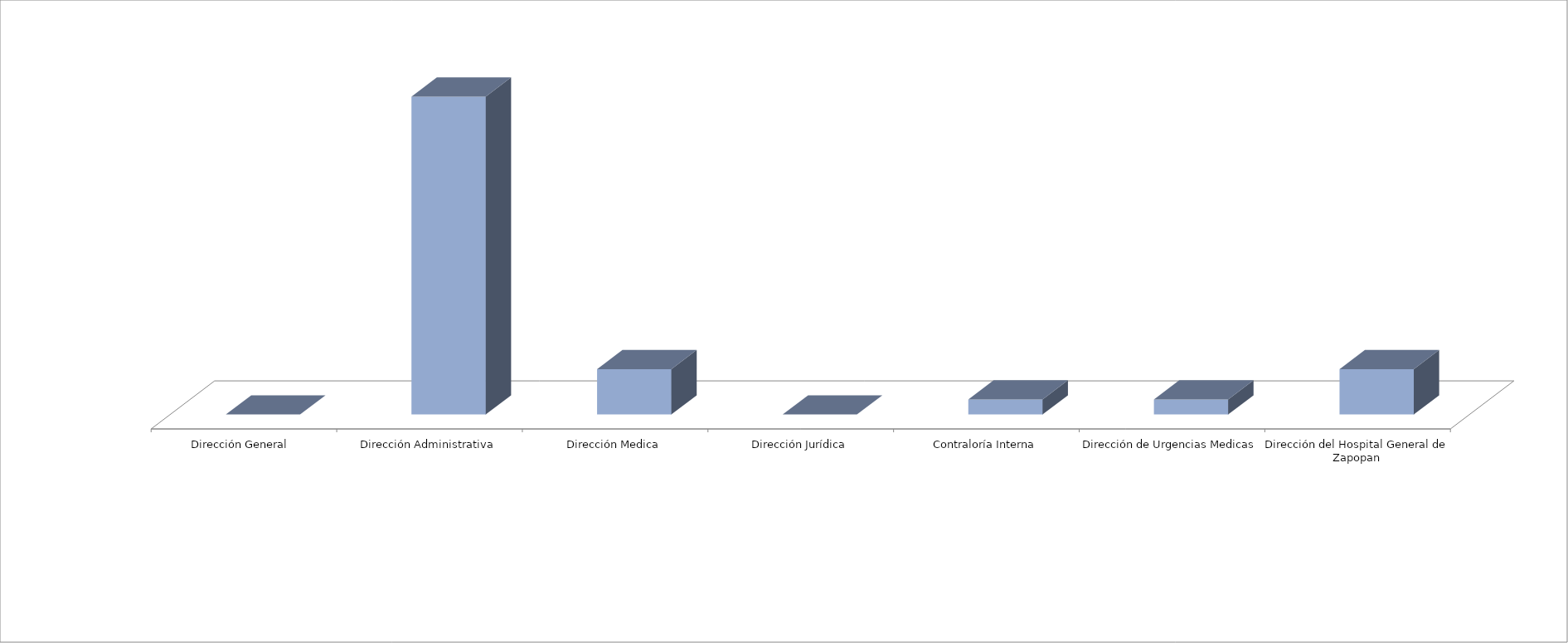
| Category | Series 0 | Series 1 |
|---|---|---|
| Dirección General  |  | 0 |
| Dirección Administrativa |  | 21 |
| Dirección Medica |  | 3 |
| Dirección Jurídica |  | 0 |
| Contraloría Interna |  | 1 |
| Dirección de Urgencias Medicas |  | 1 |
| Dirección del Hospital General de Zapopan |  | 3 |